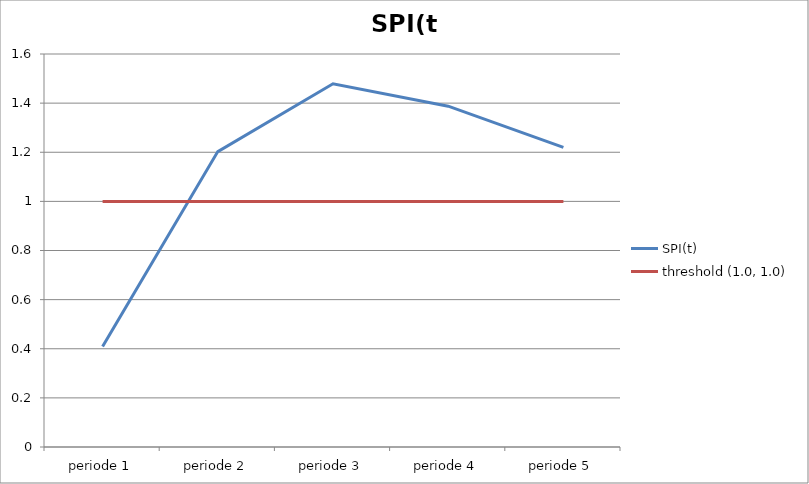
| Category | SPI(t) | threshold (1.0, 1.0) |
|---|---|---|
| periode 1 | 0.409 | 1 |
| periode 2 | 1.203 | 1 |
| periode 3 | 1.479 | 1 |
| periode 4 | 1.388 | 1 |
| periode 5 | 1.22 | 1 |